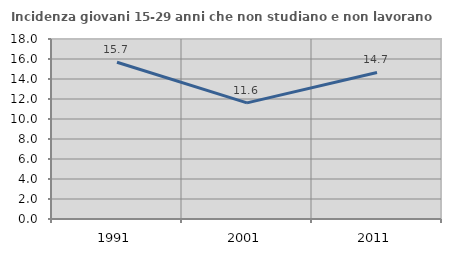
| Category | Incidenza giovani 15-29 anni che non studiano e non lavorano  |
|---|---|
| 1991.0 | 15.672 |
| 2001.0 | 11.616 |
| 2011.0 | 14.655 |